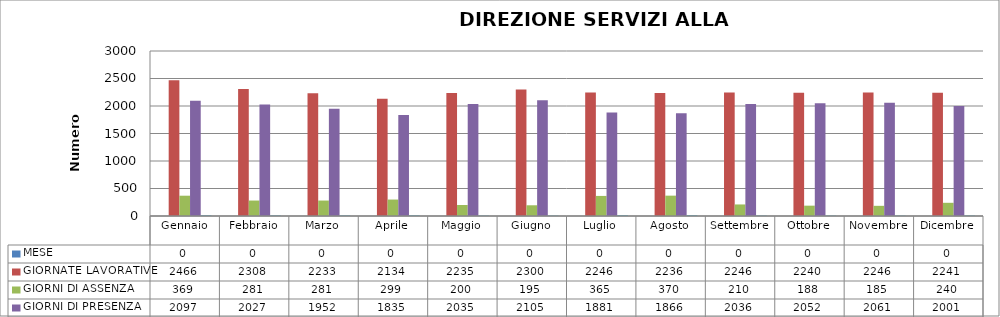
| Category | MESE | GIORNATE LAVORATIVE | GIORNI DI ASSENZA | GIORNI DI PRESENZA | %  ASSENZA |
|---|---|---|---|---|---|
| Gennaio | 0 | 2466 | 369 | 2097 | 14.964 |
| Febbraio | 0 | 2308 | 281 | 2027 | 12.175 |
| Marzo | 0 | 2233 | 281 | 1952 | 12.584 |
| Aprile | 0 | 2134 | 299 | 1835 | 14.011 |
| Maggio | 0 | 2235 | 200 | 2035 | 8.949 |
| Giugno | 0 | 2300 | 195 | 2105 | 8.478 |
| Luglio | 0 | 2246 | 365 | 1881 | 16.251 |
| Agosto | 0 | 2236 | 370 | 1866 | 16.547 |
| Settembre | 0 | 2246 | 210 | 2036 | 9.35 |
| Ottobre | 0 | 2240 | 188 | 2052 | 8.393 |
| Novembre | 0 | 2246 | 185 | 2061 | 8.237 |
| Dicembre | 0 | 2241 | 240 | 2001 | 10.71 |